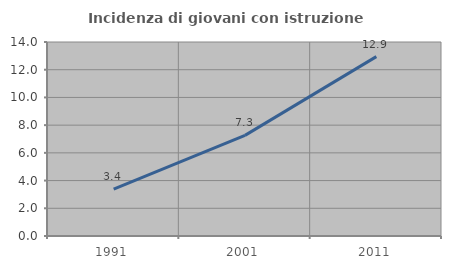
| Category | Incidenza di giovani con istruzione universitaria |
|---|---|
| 1991.0 | 3.383 |
| 2001.0 | 7.261 |
| 2011.0 | 12.945 |